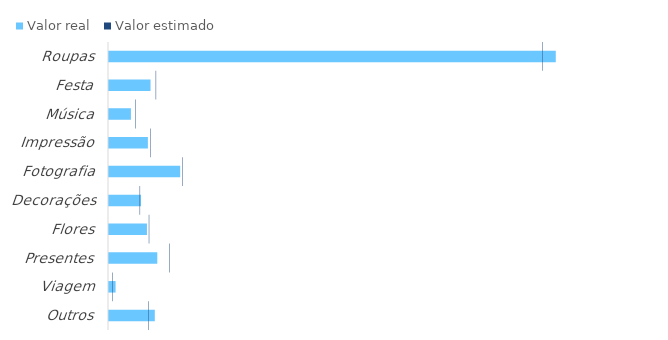
| Category | Valor real |
|---|---|
| Roupas | 9770 |
| Festa | 928 |
| Música | 500 |
| Impressão | 870 |
| Fotografia | 1575 |
| Decorações | 720 |
| Flores | 850 |
| Presentes | 1075 |
| Viagem | 165 |
| Outros | 1021 |